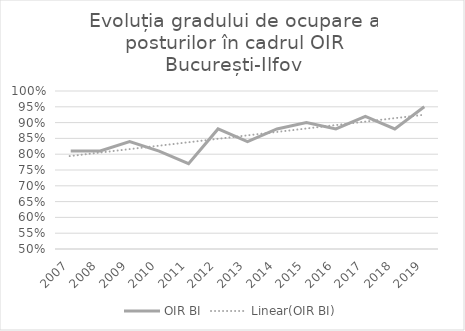
| Category | OIR BI |
|---|---|
| 2007.0 | 0.81 |
| 2008.0 | 0.81 |
| 2009.0 | 0.84 |
| 2010.0 | 0.81 |
| 2011.0 | 0.77 |
| 2012.0 | 0.88 |
| 2013.0 | 0.84 |
| 2014.0 | 0.88 |
| 2015.0 | 0.9 |
| 2016.0 | 0.88 |
| 2017.0 | 0.92 |
| 2018.0 | 0.88 |
| 2019.0 | 0.95 |